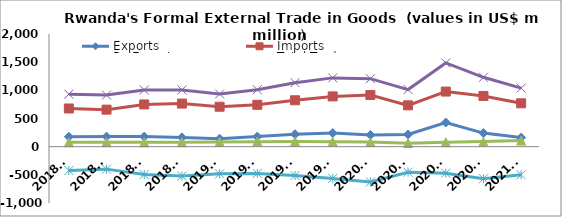
| Category | Exports | Imports | Re-Exports | Total Trade | Trade Balance |
|---|---|---|---|---|---|
| 2018Q1 | 175.503 | 677.937 | 78.615 | 932.055 | -423.82 |
| 2018Q2 | 179.292 | 657.371 | 79.24 | 915.902 | -398.839 |
| 2018Q3 | 178.647 | 749.538 | 77.259 | 1005.444 | -493.632 |
| 2018Q4 | 164.227 | 764.887 | 78.312 | 1007.426 | -522.348 |
| 2019Q1 | 142.467 | 708.669 | 84.663 | 935.8 | -481.539 |
| 2019Q2 | 179.031 | 743.119 | 89.245 | 1011.395 | -474.843 |
| 2019Q3 | 221.379 | 823.945 | 90.655 | 1135.979 | -511.911 |
| 2019Q4 | 241.36 | 892.376 | 87.333 | 1221.068 | -563.683 |
| 2020Q1 | 207.953 | 916.682 | 82.251 | 1206.886 | -626.478 |
| 2020Q2 | 217.212 | 733.499 | 62.646 | 1013.356 | -453.641 |
| 2020Q3 | 428.776 | 978.312 | 79.358 | 1486.446 | -470.177 |
| 2020Q4 | 241.35 | 900.354 | 89.908 | 1231.612 | -569.097 |
| 2021Q1 | 161.833 | 769.768 | 108.588 | 1040.188 | -499.348 |